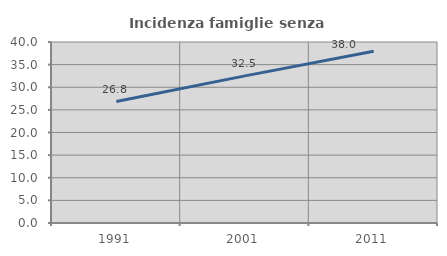
| Category | Incidenza famiglie senza nuclei |
|---|---|
| 1991.0 | 26.838 |
| 2001.0 | 32.513 |
| 2011.0 | 37.972 |